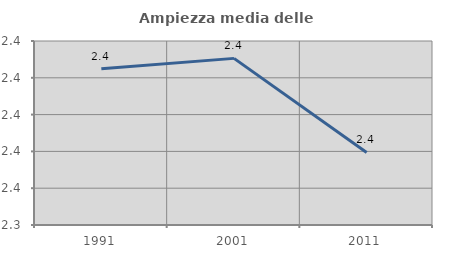
| Category | Ampiezza media delle famiglie |
|---|---|
| 1991.0 | 2.425 |
| 2001.0 | 2.431 |
| 2011.0 | 2.379 |